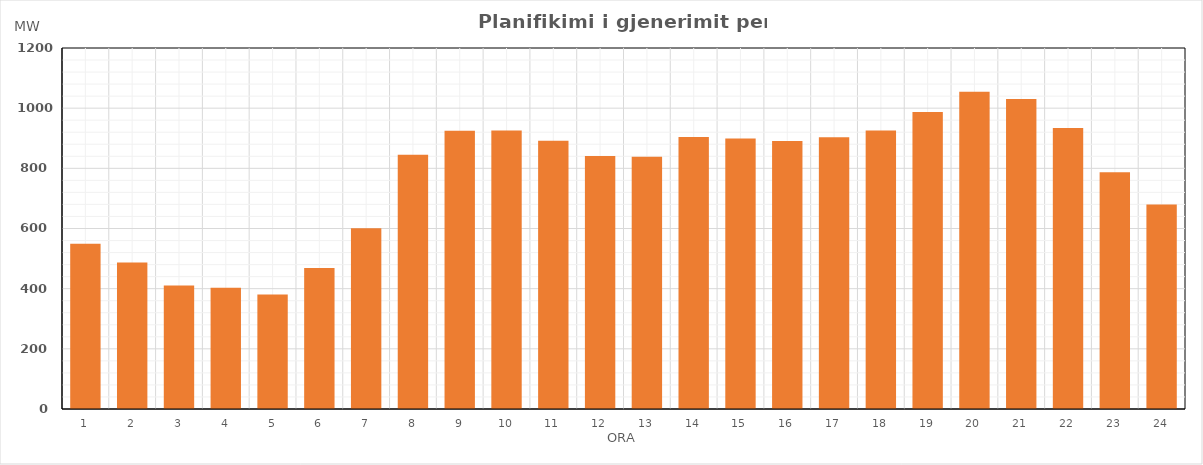
| Category | Max (MW) |
|---|---|
| 0 | 549.37 |
| 1 | 487.04 |
| 2 | 410.79 |
| 3 | 403.19 |
| 4 | 380.39 |
| 5 | 468.6 |
| 6 | 601.16 |
| 7 | 845.11 |
| 8 | 925.01 |
| 9 | 925.49 |
| 10 | 891.96 |
| 11 | 841.35 |
| 12 | 838.24 |
| 13 | 904.43 |
| 14 | 899.55 |
| 15 | 890.66 |
| 16 | 903.14 |
| 17 | 925.59 |
| 18 | 987.51 |
| 19 | 1054.66 |
| 20 | 1030.28 |
| 21 | 934.29 |
| 22 | 787.37 |
| 23 | 679.44 |